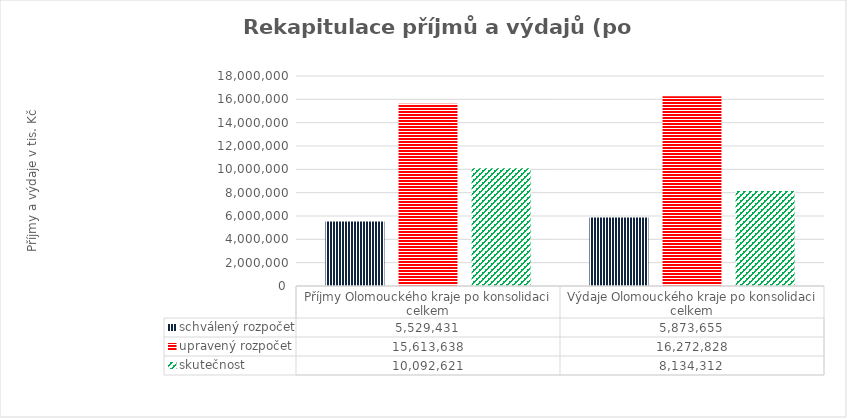
| Category | schválený rozpočet | upravený rozpočet | skutečnost |
|---|---|---|---|
| Příjmy Olomouckého kraje po konsolidaci celkem | 5529431 | 15613638 | 10092621 |
| Výdaje Olomouckého kraje po konsolidaci celkem | 5873655 | 16272828 | 8134312 |